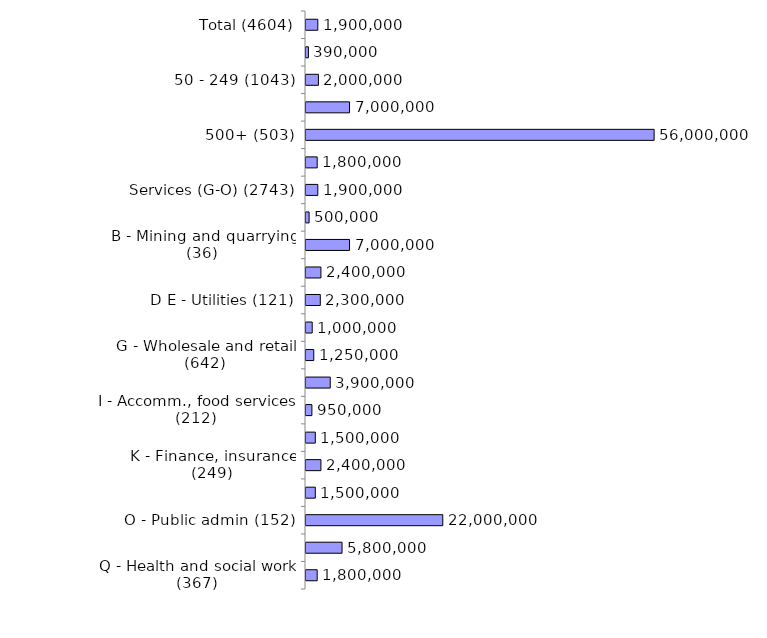
| Category | Series 0 |
|---|---|
| Total (4604) | 1900000 |
| 10-49 (2678) | 390000 |
| 50 - 249 (1043) | 2000000 |
| 250 - 499 (380) | 7000000 |
| 500+ (503) | 56000000 |
| Production (A-F) (1861) | 1800000 |
| Services (G-O) (2743) | 1900000 |
| A - Agriculture (135) | 500000 |
| B - Mining and quarrying (36) | 7000000 |
| C - Manufacturing (1396) | 2400000 |
| D E - Utilities (121) | 2300000 |
| F - Construction (173) | 1000000 |
| G - Wholesale and retail (642) | 1250000 |
| H - Transport , storage (203) | 3900000 |
| I - Accomm., food services (212) | 950000 |
| J - Information, comms (170) | 1500000 |
| K - Finance, insurance (249) | 2400000 |
| LMNRS - Bus/tech/admin/arts/other (366) | 1500000 |
| O - Public admin (152) | 22000000 |
| P - Education (382) | 5800000 |
| Q - Health and social work (367) | 1800000 |